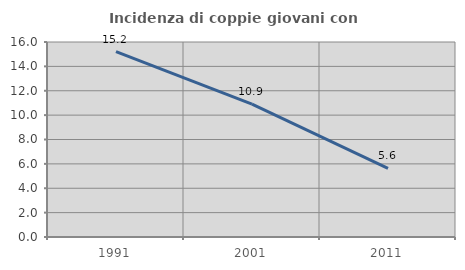
| Category | Incidenza di coppie giovani con figli |
|---|---|
| 1991.0 | 15.212 |
| 2001.0 | 10.905 |
| 2011.0 | 5.623 |